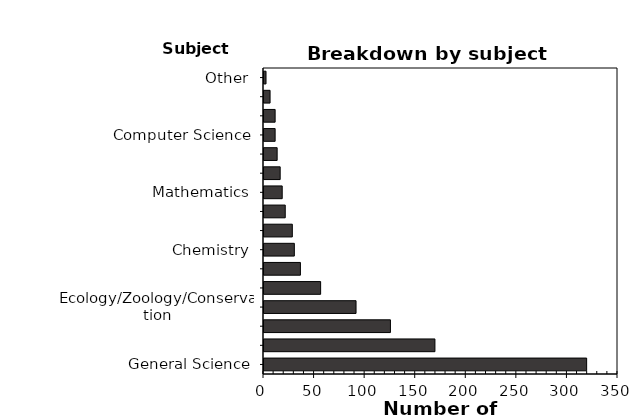
| Category | Series 0 |
|---|---|
| General Science | 319 |
| Physics and Astronomy | 169 |
| Biology | 125 |
| Ecology/Zoology/Conservation | 91 |
| Oceanography/Marine Biology | 56 |
| Psychology and Neuroscience | 36 |
| Chemistry | 30 |
| Climate Change/Atmospheric Sciences | 28 |
| Geology/Geography/Earth Sciences | 21 |
| Mathematics | 18 |
| Paleontology/Anthropology/Archaeology | 16 |
| Medical/Pharmacology | 13 |
| Computer Science | 11 |
| Engineering | 11 |
| Statistics/Data Science | 6 |
| Other | 2 |